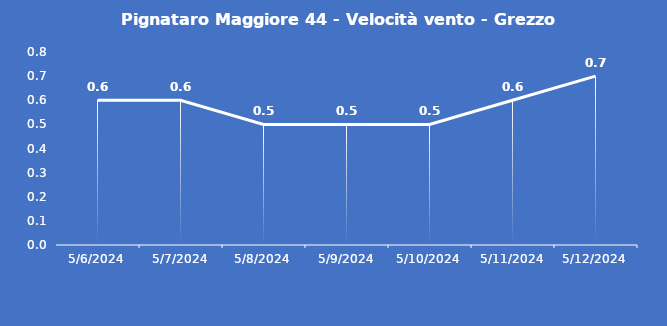
| Category | Pignataro Maggiore 44 - Velocità vento - Grezzo (m/s) |
|---|---|
| 5/6/24 | 0.6 |
| 5/7/24 | 0.6 |
| 5/8/24 | 0.5 |
| 5/9/24 | 0.5 |
| 5/10/24 | 0.5 |
| 5/11/24 | 0.6 |
| 5/12/24 | 0.7 |